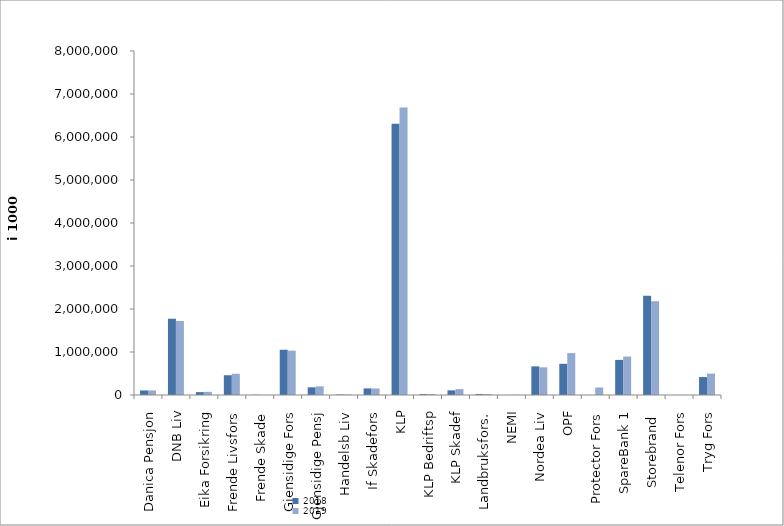
| Category | 2018 | 2019 |
|---|---|---|
| Danica Pensjon | 105522.829 | 106551.426 |
| DNB Liv | 1773028 | 1720403.8 |
| Eika Forsikring | 66623 | 73468 |
| Frende Livsfors | 460011 | 493427 |
| Frende Skade | 4814 | 1699 |
| Gjensidige Fors | 1052245 | 1031602 |
| Gjensidige Pensj | 178625 | 201661 |
| Handelsb Liv | 10248 | 9227.875 |
| If Skadefors | 153678.716 | 152402.346 |
| KLP | 6307422.436 | 6685288.074 |
| KLP Bedriftsp | 20618 | 23364 |
| KLP Skadef | 107643.077 | 136835 |
| Landbruksfors. | 21888.015 | 22249 |
| NEMI | 620.454 | 4425.974 |
| Nordea Liv | 665744.159 | 643709.206 |
| OPF | 725316 | 973969.145 |
| Protector Fors | 0 | 174427.981 |
| SpareBank 1 | 816522.198 | 894213.309 |
| Storebrand  | 2307542.627 | 2180985.924 |
| Telenor Fors | 0 | 0 |
| Tryg Fors | 417186 | 497838 |